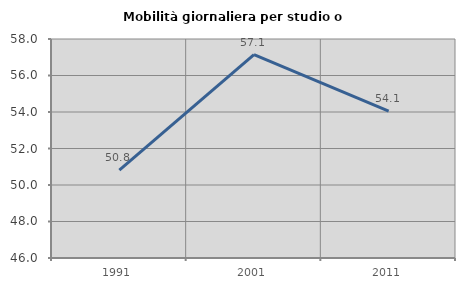
| Category | Mobilità giornaliera per studio o lavoro |
|---|---|
| 1991.0 | 50.809 |
| 2001.0 | 57.143 |
| 2011.0 | 54.054 |